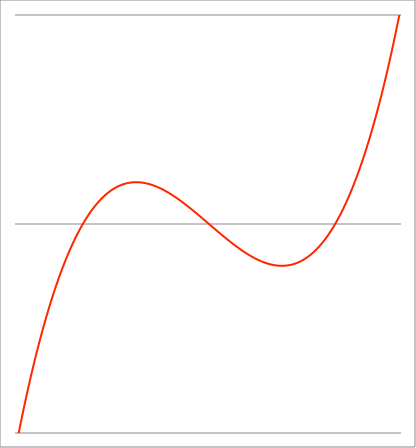
| Category | Series 1 |
|---|---|
| -3.65 | -1.066 |
| -3.64735 | -1.061 |
| -3.6447 | -1.056 |
| -3.64205 | -1.052 |
| -3.6394 | -1.047 |
| -3.63675 | -1.042 |
| -3.6341 | -1.037 |
| -3.63145 | -1.033 |
| -3.628799999999999 | -1.028 |
| -3.626149999999999 | -1.023 |
| -3.623499999999999 | -1.019 |
| -3.620849999999999 | -1.014 |
| -3.618199999999999 | -1.009 |
| -3.615549999999999 | -1.005 |
| -3.612899999999999 | -1 |
| -3.610249999999999 | -0.995 |
| -3.6076 | -0.991 |
| -3.604949999999999 | -0.986 |
| -3.602299999999999 | -0.982 |
| -3.599649999999999 | -0.977 |
| -3.596999999999999 | -0.972 |
| -3.594349999999999 | -0.968 |
| -3.591699999999999 | -0.963 |
| -3.589049999999999 | -0.959 |
| -3.586399999999999 | -0.954 |
| -3.583749999999999 | -0.95 |
| -3.581099999999999 | -0.945 |
| -3.578449999999999 | -0.941 |
| -3.575799999999999 | -0.936 |
| -3.573149999999999 | -0.932 |
| -3.570499999999999 | -0.927 |
| -3.567849999999999 | -0.923 |
| -3.565199999999999 | -0.918 |
| -3.562549999999999 | -0.914 |
| -3.559899999999998 | -0.91 |
| -3.557249999999998 | -0.905 |
| -3.554599999999998 | -0.901 |
| -3.551949999999998 | -0.896 |
| -3.549299999999998 | -0.892 |
| -3.546649999999998 | -0.888 |
| -3.543999999999998 | -0.883 |
| -3.541349999999998 | -0.879 |
| -3.538699999999998 | -0.875 |
| -3.536049999999998 | -0.87 |
| -3.533399999999998 | -0.866 |
| -3.530749999999998 | -0.862 |
| -3.528099999999998 | -0.857 |
| -3.525449999999998 | -0.853 |
| -3.522799999999998 | -0.849 |
| -3.520149999999998 | -0.845 |
| -3.517499999999998 | -0.84 |
| -3.514849999999998 | -0.836 |
| -3.512199999999998 | -0.832 |
| -3.509549999999998 | -0.828 |
| -3.506899999999998 | -0.823 |
| -3.504249999999998 | -0.819 |
| -3.501599999999998 | -0.815 |
| -3.498949999999998 | -0.811 |
| -3.496299999999997 | -0.807 |
| -3.493649999999997 | -0.803 |
| -3.490999999999997 | -0.798 |
| -3.488349999999997 | -0.794 |
| -3.485699999999997 | -0.79 |
| -3.483049999999997 | -0.786 |
| -3.480399999999997 | -0.782 |
| -3.477749999999997 | -0.778 |
| -3.475099999999997 | -0.774 |
| -3.472449999999997 | -0.77 |
| -3.469799999999997 | -0.766 |
| -3.467149999999997 | -0.762 |
| -3.464499999999997 | -0.758 |
| -3.461849999999997 | -0.753 |
| -3.459199999999997 | -0.749 |
| -3.456549999999997 | -0.745 |
| -3.453899999999997 | -0.741 |
| -3.451249999999997 | -0.737 |
| -3.448599999999997 | -0.734 |
| -3.445949999999997 | -0.73 |
| -3.443299999999997 | -0.726 |
| -3.440649999999997 | -0.722 |
| -3.437999999999997 | -0.718 |
| -3.435349999999997 | -0.714 |
| -3.432699999999997 | -0.71 |
| -3.430049999999996 | -0.706 |
| -3.427399999999996 | -0.702 |
| -3.424749999999996 | -0.698 |
| -3.422099999999996 | -0.694 |
| -3.419449999999996 | -0.69 |
| -3.416799999999996 | -0.687 |
| -3.414149999999996 | -0.683 |
| -3.411499999999996 | -0.679 |
| -3.408849999999996 | -0.675 |
| -3.406199999999996 | -0.671 |
| -3.403549999999996 | -0.667 |
| -3.400899999999996 | -0.664 |
| -3.398249999999996 | -0.66 |
| -3.395599999999996 | -0.656 |
| -3.392949999999996 | -0.652 |
| -3.390299999999996 | -0.649 |
| -3.387649999999996 | -0.645 |
| -3.384999999999996 | -0.641 |
| -3.382349999999996 | -0.637 |
| -3.379699999999996 | -0.634 |
| -3.377049999999996 | -0.63 |
| -3.374399999999996 | -0.626 |
| -3.371749999999996 | -0.623 |
| -3.369099999999995 | -0.619 |
| -3.366449999999995 | -0.615 |
| -3.363799999999995 | -0.612 |
| -3.361149999999995 | -0.608 |
| -3.358499999999995 | -0.604 |
| -3.355849999999995 | -0.601 |
| -3.353199999999995 | -0.597 |
| -3.350549999999995 | -0.594 |
| -3.347899999999995 | -0.59 |
| -3.345249999999995 | -0.586 |
| -3.342599999999995 | -0.583 |
| -3.339949999999995 | -0.579 |
| -3.337299999999995 | -0.576 |
| -3.334649999999995 | -0.572 |
| -3.331999999999995 | -0.569 |
| -3.329349999999995 | -0.565 |
| -3.326699999999995 | -0.562 |
| -3.324049999999995 | -0.558 |
| -3.321399999999995 | -0.555 |
| -3.318749999999995 | -0.551 |
| -3.316099999999995 | -0.548 |
| -3.313449999999995 | -0.544 |
| -3.310799999999995 | -0.541 |
| -3.308149999999995 | -0.537 |
| -3.305499999999995 | -0.534 |
| -3.302849999999994 | -0.53 |
| -3.300199999999994 | -0.527 |
| -3.297549999999994 | -0.524 |
| -3.294899999999994 | -0.52 |
| -3.292249999999994 | -0.517 |
| -3.289599999999994 | -0.513 |
| -3.286949999999994 | -0.51 |
| -3.284299999999994 | -0.507 |
| -3.281649999999994 | -0.503 |
| -3.278999999999994 | -0.5 |
| -3.276349999999994 | -0.497 |
| -3.273699999999994 | -0.493 |
| -3.271049999999994 | -0.49 |
| -3.268399999999994 | -0.487 |
| -3.265749999999994 | -0.483 |
| -3.263099999999994 | -0.48 |
| -3.260449999999994 | -0.477 |
| -3.257799999999994 | -0.474 |
| -3.255149999999994 | -0.47 |
| -3.252499999999994 | -0.467 |
| -3.249849999999994 | -0.464 |
| -3.247199999999993 | -0.461 |
| -3.244549999999994 | -0.457 |
| -3.241899999999994 | -0.454 |
| -3.239249999999994 | -0.451 |
| -3.236599999999993 | -0.448 |
| -3.233949999999993 | -0.445 |
| -3.231299999999993 | -0.442 |
| -3.228649999999993 | -0.438 |
| -3.225999999999993 | -0.435 |
| -3.223349999999993 | -0.432 |
| -3.220699999999993 | -0.429 |
| -3.218049999999993 | -0.426 |
| -3.215399999999993 | -0.423 |
| -3.212749999999993 | -0.42 |
| -3.210099999999993 | -0.417 |
| -3.207449999999993 | -0.413 |
| -3.204799999999993 | -0.41 |
| -3.202149999999993 | -0.407 |
| -3.199499999999993 | -0.404 |
| -3.196849999999993 | -0.401 |
| -3.194199999999993 | -0.398 |
| -3.191549999999993 | -0.395 |
| -3.188899999999993 | -0.392 |
| -3.186249999999993 | -0.389 |
| -3.183599999999992 | -0.386 |
| -3.180949999999993 | -0.383 |
| -3.178299999999993 | -0.38 |
| -3.175649999999993 | -0.377 |
| -3.172999999999992 | -0.374 |
| -3.170349999999992 | -0.371 |
| -3.167699999999992 | -0.368 |
| -3.165049999999992 | -0.365 |
| -3.162399999999992 | -0.362 |
| -3.159749999999992 | -0.359 |
| -3.157099999999992 | -0.357 |
| -3.154449999999992 | -0.354 |
| -3.151799999999992 | -0.351 |
| -3.149149999999992 | -0.348 |
| -3.146499999999992 | -0.345 |
| -3.143849999999992 | -0.342 |
| -3.141199999999992 | -0.339 |
| -3.138549999999992 | -0.336 |
| -3.135899999999992 | -0.334 |
| -3.133249999999992 | -0.331 |
| -3.130599999999992 | -0.328 |
| -3.127949999999992 | -0.325 |
| -3.125299999999992 | -0.322 |
| -3.122649999999992 | -0.32 |
| -3.119999999999992 | -0.317 |
| -3.117349999999992 | -0.314 |
| -3.114699999999992 | -0.311 |
| -3.112049999999992 | -0.309 |
| -3.109399999999991 | -0.306 |
| -3.106749999999991 | -0.303 |
| -3.104099999999991 | -0.3 |
| -3.101449999999991 | -0.298 |
| -3.098799999999991 | -0.295 |
| -3.096149999999991 | -0.292 |
| -3.093499999999991 | -0.289 |
| -3.090849999999991 | -0.287 |
| -3.088199999999991 | -0.284 |
| -3.085549999999991 | -0.281 |
| -3.082899999999991 | -0.279 |
| -3.080249999999991 | -0.276 |
| -3.077599999999991 | -0.273 |
| -3.074949999999991 | -0.271 |
| -3.072299999999991 | -0.268 |
| -3.069649999999991 | -0.266 |
| -3.066999999999991 | -0.263 |
| -3.064349999999991 | -0.26 |
| -3.061699999999991 | -0.258 |
| -3.059049999999991 | -0.255 |
| -3.056399999999991 | -0.253 |
| -3.053749999999991 | -0.25 |
| -3.051099999999991 | -0.248 |
| -3.048449999999991 | -0.245 |
| -3.045799999999991 | -0.242 |
| -3.04314999999999 | -0.24 |
| -3.04049999999999 | -0.237 |
| -3.03784999999999 | -0.235 |
| -3.03519999999999 | -0.232 |
| -3.03254999999999 | -0.23 |
| -3.02989999999999 | -0.227 |
| -3.02724999999999 | -0.225 |
| -3.02459999999999 | -0.223 |
| -3.02194999999999 | -0.22 |
| -3.01929999999999 | -0.218 |
| -3.01664999999999 | -0.215 |
| -3.01399999999999 | -0.213 |
| -3.01134999999999 | -0.21 |
| -3.00869999999999 | -0.208 |
| -3.00604999999999 | -0.205 |
| -3.00339999999999 | -0.203 |
| -3.00074999999999 | -0.201 |
| -2.99809999999999 | -0.198 |
| -2.99544999999999 | -0.196 |
| -2.99279999999999 | -0.194 |
| -2.99014999999999 | -0.191 |
| -2.98749999999999 | -0.189 |
| -2.98484999999999 | -0.187 |
| -2.982199999999989 | -0.184 |
| -2.979549999999989 | -0.182 |
| -2.976899999999989 | -0.18 |
| -2.974249999999989 | -0.177 |
| -2.971599999999989 | -0.175 |
| -2.968949999999989 | -0.173 |
| -2.966299999999989 | -0.17 |
| -2.963649999999989 | -0.168 |
| -2.960999999999989 | -0.166 |
| -2.958349999999989 | -0.164 |
| -2.955699999999989 | -0.161 |
| -2.953049999999989 | -0.159 |
| -2.950399999999989 | -0.157 |
| -2.947749999999989 | -0.155 |
| -2.945099999999989 | -0.152 |
| -2.942449999999989 | -0.15 |
| -2.939799999999989 | -0.148 |
| -2.937149999999989 | -0.146 |
| -2.934499999999989 | -0.144 |
| -2.931849999999989 | -0.141 |
| -2.929199999999989 | -0.139 |
| -2.926549999999989 | -0.137 |
| -2.923899999999989 | -0.135 |
| -2.921249999999989 | -0.133 |
| -2.918599999999989 | -0.131 |
| -2.915949999999988 | -0.129 |
| -2.913299999999988 | -0.126 |
| -2.910649999999988 | -0.124 |
| -2.907999999999988 | -0.122 |
| -2.905349999999988 | -0.12 |
| -2.902699999999988 | -0.118 |
| -2.900049999999988 | -0.116 |
| -2.897399999999988 | -0.114 |
| -2.894749999999988 | -0.112 |
| -2.892099999999988 | -0.11 |
| -2.889449999999988 | -0.108 |
| -2.886799999999988 | -0.106 |
| -2.884149999999988 | -0.104 |
| -2.881499999999988 | -0.102 |
| -2.878849999999988 | -0.1 |
| -2.876199999999988 | -0.098 |
| -2.873549999999988 | -0.096 |
| -2.870899999999988 | -0.094 |
| -2.868249999999988 | -0.092 |
| -2.865599999999988 | -0.09 |
| -2.862949999999988 | -0.088 |
| -2.860299999999988 | -0.086 |
| -2.857649999999988 | -0.084 |
| -2.854999999999987 | -0.082 |
| -2.852349999999987 | -0.08 |
| -2.849699999999987 | -0.078 |
| -2.847049999999987 | -0.076 |
| -2.844399999999987 | -0.074 |
| -2.841749999999987 | -0.072 |
| -2.839099999999987 | -0.07 |
| -2.836449999999987 | -0.068 |
| -2.833799999999987 | -0.067 |
| -2.831149999999987 | -0.065 |
| -2.828499999999987 | -0.063 |
| -2.825849999999987 | -0.061 |
| -2.823199999999987 | -0.059 |
| -2.820549999999987 | -0.057 |
| -2.817899999999987 | -0.055 |
| -2.815249999999987 | -0.054 |
| -2.812599999999987 | -0.052 |
| -2.809949999999987 | -0.05 |
| -2.807299999999987 | -0.048 |
| -2.804649999999987 | -0.046 |
| -2.801999999999987 | -0.045 |
| -2.799349999999987 | -0.043 |
| -2.796699999999987 | -0.041 |
| -2.794049999999987 | -0.039 |
| -2.791399999999986 | -0.037 |
| -2.788749999999986 | -0.036 |
| -2.786099999999986 | -0.034 |
| -2.783449999999986 | -0.032 |
| -2.780799999999986 | -0.03 |
| -2.778149999999986 | -0.029 |
| -2.775499999999986 | -0.027 |
| -2.772849999999986 | -0.025 |
| -2.770199999999986 | -0.024 |
| -2.767549999999986 | -0.022 |
| -2.764899999999986 | -0.02 |
| -2.762249999999986 | -0.019 |
| -2.759599999999986 | -0.017 |
| -2.756949999999986 | -0.015 |
| -2.754299999999986 | -0.014 |
| -2.751649999999986 | -0.012 |
| -2.748999999999986 | -0.01 |
| -2.746349999999986 | -0.009 |
| -2.743699999999986 | -0.007 |
| -2.741049999999986 | -0.005 |
| -2.738399999999986 | -0.004 |
| -2.735749999999986 | -0.002 |
| -2.733099999999986 | -0.001 |
| -2.730449999999986 | 0.001 |
| -2.727799999999985 | 0.003 |
| -2.725149999999985 | 0.004 |
| -2.722499999999985 | 0.006 |
| -2.719849999999985 | 0.007 |
| -2.717199999999985 | 0.009 |
| -2.714549999999985 | 0.01 |
| -2.711899999999985 | 0.012 |
| -2.709249999999985 | 0.013 |
| -2.706599999999985 | 0.015 |
| -2.703949999999985 | 0.016 |
| -2.701299999999985 | 0.018 |
| -2.698649999999985 | 0.019 |
| -2.695999999999985 | 0.021 |
| -2.693349999999985 | 0.022 |
| -2.690699999999985 | 0.024 |
| -2.688049999999985 | 0.025 |
| -2.685399999999985 | 0.027 |
| -2.682749999999985 | 0.028 |
| -2.680099999999985 | 0.03 |
| -2.677449999999985 | 0.031 |
| -2.674799999999985 | 0.033 |
| -2.672149999999985 | 0.034 |
| -2.669499999999985 | 0.036 |
| -2.666849999999985 | 0.037 |
| -2.664199999999984 | 0.038 |
| -2.661549999999984 | 0.04 |
| -2.658899999999984 | 0.041 |
| -2.656249999999984 | 0.043 |
| -2.653599999999984 | 0.044 |
| -2.650949999999984 | 0.045 |
| -2.648299999999984 | 0.047 |
| -2.645649999999984 | 0.048 |
| -2.642999999999984 | 0.049 |
| -2.640349999999984 | 0.051 |
| -2.637699999999984 | 0.052 |
| -2.635049999999984 | 0.053 |
| -2.632399999999984 | 0.055 |
| -2.629749999999984 | 0.056 |
| -2.627099999999984 | 0.057 |
| -2.624449999999984 | 0.059 |
| -2.621799999999984 | 0.06 |
| -2.619149999999984 | 0.061 |
| -2.616499999999984 | 0.063 |
| -2.613849999999984 | 0.064 |
| -2.611199999999984 | 0.065 |
| -2.608549999999984 | 0.066 |
| -2.605899999999984 | 0.068 |
| -2.603249999999984 | 0.069 |
| -2.600599999999984 | 0.07 |
| -2.597949999999984 | 0.071 |
| -2.595299999999983 | 0.073 |
| -2.592649999999983 | 0.074 |
| -2.589999999999983 | 0.075 |
| -2.587349999999983 | 0.076 |
| -2.584699999999983 | 0.077 |
| -2.582049999999983 | 0.079 |
| -2.579399999999983 | 0.08 |
| -2.576749999999983 | 0.081 |
| -2.574099999999983 | 0.082 |
| -2.571449999999983 | 0.083 |
| -2.568799999999983 | 0.085 |
| -2.566149999999983 | 0.086 |
| -2.563499999999983 | 0.087 |
| -2.560849999999983 | 0.088 |
| -2.558199999999983 | 0.089 |
| -2.555549999999983 | 0.09 |
| -2.552899999999983 | 0.091 |
| -2.550249999999983 | 0.093 |
| -2.547599999999983 | 0.094 |
| -2.544949999999983 | 0.095 |
| -2.542299999999983 | 0.096 |
| -2.539649999999983 | 0.097 |
| -2.536999999999983 | 0.098 |
| -2.534349999999983 | 0.099 |
| -2.531699999999983 | 0.1 |
| -2.529049999999982 | 0.101 |
| -2.526399999999982 | 0.102 |
| -2.523749999999982 | 0.103 |
| -2.521099999999982 | 0.104 |
| -2.518449999999982 | 0.105 |
| -2.515799999999982 | 0.106 |
| -2.513149999999982 | 0.107 |
| -2.510499999999982 | 0.109 |
| -2.507849999999982 | 0.11 |
| -2.505199999999982 | 0.111 |
| -2.502549999999982 | 0.112 |
| -2.499899999999982 | 0.113 |
| -2.497249999999982 | 0.114 |
| -2.494599999999982 | 0.115 |
| -2.491949999999982 | 0.115 |
| -2.489299999999982 | 0.116 |
| -2.486649999999982 | 0.117 |
| -2.483999999999982 | 0.118 |
| -2.481349999999982 | 0.119 |
| -2.478699999999982 | 0.12 |
| -2.476049999999982 | 0.121 |
| -2.473399999999982 | 0.122 |
| -2.470749999999982 | 0.123 |
| -2.468099999999981 | 0.124 |
| -2.465449999999981 | 0.125 |
| -2.462799999999981 | 0.126 |
| -2.460149999999981 | 0.127 |
| -2.457499999999981 | 0.128 |
| -2.454849999999981 | 0.129 |
| -2.452199999999981 | 0.129 |
| -2.449549999999981 | 0.13 |
| -2.446899999999981 | 0.131 |
| -2.444249999999981 | 0.132 |
| -2.441599999999981 | 0.133 |
| -2.438949999999981 | 0.134 |
| -2.436299999999981 | 0.135 |
| -2.433649999999981 | 0.135 |
| -2.430999999999981 | 0.136 |
| -2.428349999999981 | 0.137 |
| -2.425699999999981 | 0.138 |
| -2.423049999999981 | 0.139 |
| -2.420399999999981 | 0.14 |
| -2.417749999999981 | 0.14 |
| -2.415099999999981 | 0.141 |
| -2.412449999999981 | 0.142 |
| -2.409799999999981 | 0.143 |
| -2.407149999999981 | 0.144 |
| -2.404499999999981 | 0.144 |
| -2.40184999999998 | 0.145 |
| -2.39919999999998 | 0.146 |
| -2.39654999999998 | 0.147 |
| -2.39389999999998 | 0.147 |
| -2.39124999999998 | 0.148 |
| -2.38859999999998 | 0.149 |
| -2.38594999999998 | 0.15 |
| -2.38329999999998 | 0.15 |
| -2.38064999999998 | 0.151 |
| -2.37799999999998 | 0.152 |
| -2.37534999999998 | 0.152 |
| -2.37269999999998 | 0.153 |
| -2.37004999999998 | 0.154 |
| -2.36739999999998 | 0.155 |
| -2.36474999999998 | 0.155 |
| -2.36209999999998 | 0.156 |
| -2.35944999999998 | 0.157 |
| -2.35679999999998 | 0.157 |
| -2.35414999999998 | 0.158 |
| -2.35149999999998 | 0.159 |
| -2.34884999999998 | 0.159 |
| -2.34619999999998 | 0.16 |
| -2.34354999999998 | 0.161 |
| -2.34089999999998 | 0.161 |
| -2.338249999999979 | 0.162 |
| -2.335599999999979 | 0.162 |
| -2.332949999999979 | 0.163 |
| -2.330299999999979 | 0.164 |
| -2.327649999999979 | 0.164 |
| -2.324999999999979 | 0.165 |
| -2.322349999999979 | 0.165 |
| -2.319699999999979 | 0.166 |
| -2.317049999999979 | 0.167 |
| -2.314399999999979 | 0.167 |
| -2.311749999999979 | 0.168 |
| -2.309099999999979 | 0.168 |
| -2.306449999999979 | 0.169 |
| -2.303799999999979 | 0.17 |
| -2.301149999999979 | 0.17 |
| -2.298499999999979 | 0.171 |
| -2.295849999999979 | 0.171 |
| -2.293199999999979 | 0.172 |
| -2.290549999999979 | 0.172 |
| -2.287899999999979 | 0.173 |
| -2.285249999999979 | 0.173 |
| -2.282599999999979 | 0.174 |
| -2.279949999999979 | 0.174 |
| -2.277299999999979 | 0.175 |
| -2.274649999999979 | 0.175 |
| -2.271999999999978 | 0.176 |
| -2.269349999999978 | 0.176 |
| -2.266699999999978 | 0.177 |
| -2.264049999999978 | 0.177 |
| -2.261399999999978 | 0.178 |
| -2.258749999999978 | 0.178 |
| -2.256099999999978 | 0.179 |
| -2.253449999999978 | 0.179 |
| -2.250799999999978 | 0.18 |
| -2.248149999999978 | 0.18 |
| -2.245499999999978 | 0.18 |
| -2.242849999999978 | 0.181 |
| -2.240199999999978 | 0.181 |
| -2.237549999999978 | 0.182 |
| -2.234899999999978 | 0.182 |
| -2.232249999999978 | 0.183 |
| -2.229599999999978 | 0.183 |
| -2.226949999999978 | 0.183 |
| -2.224299999999978 | 0.184 |
| -2.221649999999978 | 0.184 |
| -2.218999999999978 | 0.185 |
| -2.216349999999978 | 0.185 |
| -2.213699999999978 | 0.185 |
| -2.211049999999978 | 0.186 |
| -2.208399999999977 | 0.186 |
| -2.205749999999977 | 0.186 |
| -2.203099999999977 | 0.187 |
| -2.200449999999977 | 0.187 |
| -2.197799999999977 | 0.187 |
| -2.195149999999977 | 0.188 |
| -2.192499999999977 | 0.188 |
| -2.189849999999977 | 0.189 |
| -2.187199999999977 | 0.189 |
| -2.184549999999977 | 0.189 |
| -2.181899999999977 | 0.189 |
| -2.179249999999977 | 0.19 |
| -2.176599999999977 | 0.19 |
| -2.173949999999977 | 0.19 |
| -2.171299999999977 | 0.191 |
| -2.168649999999977 | 0.191 |
| -2.165999999999977 | 0.191 |
| -2.163349999999977 | 0.192 |
| -2.160699999999977 | 0.192 |
| -2.158049999999977 | 0.192 |
| -2.155399999999977 | 0.192 |
| -2.152749999999977 | 0.193 |
| -2.150099999999977 | 0.193 |
| -2.147449999999977 | 0.193 |
| -2.144799999999976 | 0.193 |
| -2.142149999999976 | 0.194 |
| -2.139499999999976 | 0.194 |
| -2.136849999999976 | 0.194 |
| -2.134199999999976 | 0.194 |
| -2.131549999999976 | 0.195 |
| -2.128899999999976 | 0.195 |
| -2.126249999999976 | 0.195 |
| -2.123599999999976 | 0.195 |
| -2.120949999999976 | 0.195 |
| -2.118299999999976 | 0.196 |
| -2.115649999999976 | 0.196 |
| -2.112999999999976 | 0.196 |
| -2.110349999999976 | 0.196 |
| -2.107699999999976 | 0.196 |
| -2.105049999999976 | 0.197 |
| -2.102399999999976 | 0.197 |
| -2.099749999999976 | 0.197 |
| -2.097099999999976 | 0.197 |
| -2.094449999999976 | 0.197 |
| -2.091799999999976 | 0.197 |
| -2.089149999999976 | 0.198 |
| -2.086499999999976 | 0.198 |
| -2.083849999999976 | 0.198 |
| -2.081199999999975 | 0.198 |
| -2.078549999999975 | 0.198 |
| -2.075899999999975 | 0.198 |
| -2.073249999999975 | 0.198 |
| -2.070599999999975 | 0.198 |
| -2.067949999999975 | 0.199 |
| -2.065299999999975 | 0.199 |
| -2.062649999999975 | 0.199 |
| -2.059999999999975 | 0.199 |
| -2.057349999999975 | 0.199 |
| -2.054699999999975 | 0.199 |
| -2.052049999999975 | 0.199 |
| -2.049399999999975 | 0.199 |
| -2.046749999999975 | 0.199 |
| -2.044099999999975 | 0.199 |
| -2.041449999999975 | 0.199 |
| -2.038799999999975 | 0.2 |
| -2.036149999999975 | 0.2 |
| -2.033499999999975 | 0.2 |
| -2.030849999999975 | 0.2 |
| -2.028199999999975 | 0.2 |
| -2.025549999999975 | 0.2 |
| -2.022899999999975 | 0.2 |
| -2.020249999999975 | 0.2 |
| -2.017599999999975 | 0.2 |
| -2.014949999999974 | 0.2 |
| -2.012299999999974 | 0.2 |
| -2.009649999999974 | 0.2 |
| -2.006999999999974 | 0.2 |
| -2.004349999999974 | 0.2 |
| -2.001699999999974 | 0.2 |
| -1.999049999999974 | 0.2 |
| -1.996399999999974 | 0.2 |
| -1.993749999999974 | 0.2 |
| -1.991099999999974 | 0.2 |
| -1.988449999999974 | 0.2 |
| -1.985799999999974 | 0.2 |
| -1.983149999999974 | 0.2 |
| -1.980499999999974 | 0.2 |
| -1.977849999999974 | 0.2 |
| -1.975199999999974 | 0.2 |
| -1.972549999999974 | 0.2 |
| -1.969899999999974 | 0.2 |
| -1.967249999999974 | 0.2 |
| -1.964599999999974 | 0.2 |
| -1.961949999999974 | 0.2 |
| -1.959299999999974 | 0.2 |
| -1.956649999999974 | 0.199 |
| -1.953999999999974 | 0.199 |
| -1.951349999999973 | 0.199 |
| -1.948699999999973 | 0.199 |
| -1.946049999999973 | 0.199 |
| -1.943399999999973 | 0.199 |
| -1.940749999999973 | 0.199 |
| -1.938099999999973 | 0.199 |
| -1.935449999999973 | 0.199 |
| -1.932799999999973 | 0.199 |
| -1.930149999999973 | 0.199 |
| -1.927499999999973 | 0.198 |
| -1.924849999999973 | 0.198 |
| -1.922199999999973 | 0.198 |
| -1.919549999999973 | 0.198 |
| -1.916899999999973 | 0.198 |
| -1.914249999999973 | 0.198 |
| -1.911599999999973 | 0.198 |
| -1.908949999999973 | 0.198 |
| -1.906299999999973 | 0.197 |
| -1.903649999999973 | 0.197 |
| -1.900999999999973 | 0.197 |
| -1.898349999999973 | 0.197 |
| -1.895699999999973 | 0.197 |
| -1.893049999999973 | 0.197 |
| -1.890399999999972 | 0.197 |
| -1.887749999999972 | 0.196 |
| -1.885099999999972 | 0.196 |
| -1.882449999999972 | 0.196 |
| -1.879799999999972 | 0.196 |
| -1.877149999999972 | 0.196 |
| -1.874499999999972 | 0.195 |
| -1.871849999999972 | 0.195 |
| -1.869199999999972 | 0.195 |
| -1.866549999999972 | 0.195 |
| -1.863899999999972 | 0.195 |
| -1.861249999999972 | 0.194 |
| -1.858599999999972 | 0.194 |
| -1.855949999999972 | 0.194 |
| -1.853299999999972 | 0.194 |
| -1.850649999999972 | 0.194 |
| -1.847999999999972 | 0.193 |
| -1.845349999999972 | 0.193 |
| -1.842699999999972 | 0.193 |
| -1.840049999999972 | 0.193 |
| -1.837399999999972 | 0.192 |
| -1.834749999999972 | 0.192 |
| -1.832099999999972 | 0.192 |
| -1.829449999999972 | 0.192 |
| -1.826799999999972 | 0.192 |
| -1.824149999999971 | 0.191 |
| -1.821499999999971 | 0.191 |
| -1.818849999999971 | 0.191 |
| -1.816199999999971 | 0.19 |
| -1.813549999999971 | 0.19 |
| -1.810899999999971 | 0.19 |
| -1.808249999999971 | 0.19 |
| -1.805599999999971 | 0.189 |
| -1.802949999999971 | 0.189 |
| -1.800299999999971 | 0.189 |
| -1.797649999999971 | 0.189 |
| -1.794999999999971 | 0.188 |
| -1.792349999999971 | 0.188 |
| -1.789699999999971 | 0.188 |
| -1.787049999999971 | 0.187 |
| -1.784399999999971 | 0.187 |
| -1.781749999999971 | 0.187 |
| -1.779099999999971 | 0.186 |
| -1.776449999999971 | 0.186 |
| -1.773799999999971 | 0.186 |
| -1.771149999999971 | 0.185 |
| -1.768499999999971 | 0.185 |
| -1.765849999999971 | 0.185 |
| -1.76319999999997 | 0.185 |
| -1.76054999999997 | 0.184 |
| -1.75789999999997 | 0.184 |
| -1.75524999999997 | 0.183 |
| -1.75259999999997 | 0.183 |
| -1.74994999999997 | 0.183 |
| -1.74729999999997 | 0.182 |
| -1.74464999999997 | 0.182 |
| -1.74199999999997 | 0.182 |
| -1.73934999999997 | 0.181 |
| -1.73669999999997 | 0.181 |
| -1.73404999999997 | 0.181 |
| -1.73139999999997 | 0.18 |
| -1.72874999999997 | 0.18 |
| -1.72609999999997 | 0.18 |
| -1.72344999999997 | 0.179 |
| -1.72079999999997 | 0.179 |
| -1.71814999999997 | 0.178 |
| -1.71549999999997 | 0.178 |
| -1.71284999999997 | 0.178 |
| -1.71019999999997 | 0.177 |
| -1.70754999999997 | 0.177 |
| -1.70489999999997 | 0.176 |
| -1.70224999999997 | 0.176 |
| -1.699599999999969 | 0.176 |
| -1.696949999999969 | 0.175 |
| -1.694299999999969 | 0.175 |
| -1.691649999999969 | 0.174 |
| -1.688999999999969 | 0.174 |
| -1.686349999999969 | 0.174 |
| -1.683699999999969 | 0.173 |
| -1.681049999999969 | 0.173 |
| -1.678399999999969 | 0.172 |
| -1.675749999999969 | 0.172 |
| -1.673099999999969 | 0.171 |
| -1.67044999999997 | 0.171 |
| -1.667799999999969 | 0.171 |
| -1.665149999999969 | 0.17 |
| -1.662499999999969 | 0.17 |
| -1.659849999999969 | 0.169 |
| -1.657199999999969 | 0.169 |
| -1.654549999999969 | 0.168 |
| -1.651899999999969 | 0.168 |
| -1.649249999999969 | 0.167 |
| -1.646599999999969 | 0.167 |
| -1.643949999999969 | 0.166 |
| -1.641299999999969 | 0.166 |
| -1.638649999999969 | 0.166 |
| -1.635999999999968 | 0.165 |
| -1.633349999999968 | 0.165 |
| -1.630699999999968 | 0.164 |
| -1.628049999999968 | 0.164 |
| -1.625399999999968 | 0.163 |
| -1.622749999999968 | 0.163 |
| -1.620099999999968 | 0.162 |
| -1.617449999999968 | 0.162 |
| -1.614799999999968 | 0.161 |
| -1.612149999999968 | 0.161 |
| -1.609499999999968 | 0.16 |
| -1.606849999999968 | 0.16 |
| -1.604199999999968 | 0.159 |
| -1.601549999999968 | 0.159 |
| -1.598899999999968 | 0.158 |
| -1.596249999999968 | 0.158 |
| -1.593599999999968 | 0.157 |
| -1.590949999999968 | 0.157 |
| -1.588299999999968 | 0.156 |
| -1.585649999999968 | 0.156 |
| -1.582999999999968 | 0.155 |
| -1.580349999999968 | 0.155 |
| -1.577699999999968 | 0.154 |
| -1.575049999999968 | 0.153 |
| -1.572399999999968 | 0.153 |
| -1.569749999999968 | 0.152 |
| -1.567099999999968 | 0.152 |
| -1.564449999999967 | 0.151 |
| -1.561799999999967 | 0.151 |
| -1.559149999999967 | 0.15 |
| -1.556499999999967 | 0.15 |
| -1.553849999999967 | 0.149 |
| -1.551199999999967 | 0.149 |
| -1.548549999999967 | 0.148 |
| -1.545899999999967 | 0.148 |
| -1.543249999999967 | 0.147 |
| -1.540599999999967 | 0.146 |
| -1.537949999999967 | 0.146 |
| -1.535299999999967 | 0.145 |
| -1.532649999999967 | 0.145 |
| -1.529999999999967 | 0.144 |
| -1.527349999999967 | 0.144 |
| -1.524699999999967 | 0.143 |
| -1.522049999999967 | 0.142 |
| -1.519399999999967 | 0.142 |
| -1.516749999999967 | 0.141 |
| -1.514099999999967 | 0.141 |
| -1.511449999999967 | 0.14 |
| -1.508799999999967 | 0.139 |
| -1.506149999999967 | 0.139 |
| -1.503499999999967 | 0.138 |
| -1.500849999999966 | 0.138 |
| -1.498199999999966 | 0.137 |
| -1.495549999999966 | 0.136 |
| -1.492899999999966 | 0.136 |
| -1.490249999999966 | 0.135 |
| -1.487599999999966 | 0.135 |
| -1.484949999999966 | 0.134 |
| -1.482299999999966 | 0.133 |
| -1.479649999999966 | 0.133 |
| -1.476999999999966 | 0.132 |
| -1.474349999999966 | 0.132 |
| -1.471699999999966 | 0.131 |
| -1.469049999999966 | 0.13 |
| -1.466399999999966 | 0.13 |
| -1.463749999999966 | 0.129 |
| -1.461099999999966 | 0.129 |
| -1.458449999999966 | 0.128 |
| -1.455799999999966 | 0.127 |
| -1.453149999999966 | 0.127 |
| -1.450499999999966 | 0.126 |
| -1.447849999999966 | 0.125 |
| -1.445199999999966 | 0.125 |
| -1.442549999999966 | 0.124 |
| -1.439899999999966 | 0.123 |
| -1.437249999999965 | 0.123 |
| -1.434599999999965 | 0.122 |
| -1.431949999999965 | 0.122 |
| -1.429299999999965 | 0.121 |
| -1.426649999999965 | 0.12 |
| -1.423999999999965 | 0.12 |
| -1.421349999999965 | 0.119 |
| -1.418699999999965 | 0.118 |
| -1.416049999999965 | 0.118 |
| -1.413399999999965 | 0.117 |
| -1.410749999999965 | 0.116 |
| -1.408099999999965 | 0.116 |
| -1.405449999999965 | 0.115 |
| -1.402799999999965 | 0.114 |
| -1.400149999999965 | 0.114 |
| -1.397499999999965 | 0.113 |
| -1.394849999999965 | 0.112 |
| -1.392199999999965 | 0.112 |
| -1.389549999999965 | 0.111 |
| -1.386899999999965 | 0.11 |
| -1.384249999999965 | 0.11 |
| -1.381599999999965 | 0.109 |
| -1.378949999999965 | 0.108 |
| -1.376299999999964 | 0.108 |
| -1.373649999999964 | 0.107 |
| -1.370999999999964 | 0.106 |
| -1.368349999999964 | 0.106 |
| -1.365699999999964 | 0.105 |
| -1.363049999999964 | 0.104 |
| -1.360399999999964 | 0.103 |
| -1.357749999999964 | 0.103 |
| -1.355099999999964 | 0.102 |
| -1.352449999999964 | 0.101 |
| -1.349799999999964 | 0.101 |
| -1.347149999999964 | 0.1 |
| -1.344499999999964 | 0.099 |
| -1.341849999999964 | 0.099 |
| -1.339199999999964 | 0.098 |
| -1.336549999999964 | 0.097 |
| -1.333899999999964 | 0.096 |
| -1.331249999999964 | 0.096 |
| -1.328599999999964 | 0.095 |
| -1.325949999999964 | 0.094 |
| -1.323299999999964 | 0.094 |
| -1.320649999999964 | 0.093 |
| -1.317999999999964 | 0.092 |
| -1.315349999999964 | 0.091 |
| -1.312699999999964 | 0.091 |
| -1.310049999999963 | 0.09 |
| -1.307399999999963 | 0.089 |
| -1.304749999999963 | 0.089 |
| -1.302099999999963 | 0.088 |
| -1.299449999999963 | 0.087 |
| -1.296799999999963 | 0.086 |
| -1.294149999999963 | 0.086 |
| -1.291499999999963 | 0.085 |
| -1.288849999999963 | 0.084 |
| -1.286199999999963 | 0.084 |
| -1.283549999999963 | 0.083 |
| -1.280899999999963 | 0.082 |
| -1.278249999999963 | 0.081 |
| -1.275599999999963 | 0.081 |
| -1.272949999999963 | 0.08 |
| -1.270299999999963 | 0.079 |
| -1.267649999999963 | 0.078 |
| -1.264999999999963 | 0.078 |
| -1.262349999999963 | 0.077 |
| -1.259699999999963 | 0.076 |
| -1.257049999999963 | 0.075 |
| -1.254399999999963 | 0.075 |
| -1.251749999999963 | 0.074 |
| -1.249099999999963 | 0.073 |
| -1.246449999999963 | 0.072 |
| -1.243799999999962 | 0.072 |
| -1.241149999999962 | 0.071 |
| -1.238499999999962 | 0.07 |
| -1.235849999999962 | 0.069 |
| -1.233199999999962 | 0.069 |
| -1.230549999999962 | 0.068 |
| -1.227899999999962 | 0.067 |
| -1.225249999999962 | 0.066 |
| -1.222599999999962 | 0.066 |
| -1.219949999999962 | 0.065 |
| -1.217299999999962 | 0.064 |
| -1.214649999999962 | 0.063 |
| -1.211999999999962 | 0.063 |
| -1.209349999999962 | 0.062 |
| -1.206699999999962 | 0.061 |
| -1.204049999999962 | 0.06 |
| -1.201399999999962 | 0.06 |
| -1.198749999999962 | 0.059 |
| -1.196099999999962 | 0.058 |
| -1.193449999999962 | 0.057 |
| -1.190799999999962 | 0.057 |
| -1.188149999999962 | 0.056 |
| -1.185499999999962 | 0.055 |
| -1.182849999999962 | 0.054 |
| -1.180199999999961 | 0.053 |
| -1.177549999999961 | 0.053 |
| -1.174899999999961 | 0.052 |
| -1.172249999999961 | 0.051 |
| -1.169599999999961 | 0.05 |
| -1.166949999999961 | 0.05 |
| -1.164299999999961 | 0.049 |
| -1.161649999999961 | 0.048 |
| -1.158999999999961 | 0.047 |
| -1.156349999999961 | 0.047 |
| -1.153699999999961 | 0.046 |
| -1.151049999999961 | 0.045 |
| -1.148399999999961 | 0.044 |
| -1.145749999999961 | 0.043 |
| -1.143099999999961 | 0.043 |
| -1.140449999999961 | 0.042 |
| -1.137799999999961 | 0.041 |
| -1.135149999999961 | 0.04 |
| -1.132499999999961 | 0.04 |
| -1.129849999999961 | 0.039 |
| -1.127199999999961 | 0.038 |
| -1.124549999999961 | 0.037 |
| -1.121899999999961 | 0.036 |
| -1.119249999999961 | 0.036 |
| -1.116599999999961 | 0.035 |
| -1.11394999999996 | 0.034 |
| -1.11129999999996 | 0.033 |
| -1.10864999999996 | 0.032 |
| -1.10599999999996 | 0.032 |
| -1.10334999999996 | 0.031 |
| -1.10069999999996 | 0.03 |
| -1.09804999999996 | 0.029 |
| -1.09539999999996 | 0.029 |
| -1.09274999999996 | 0.028 |
| -1.09009999999996 | 0.027 |
| -1.08744999999996 | 0.026 |
| -1.08479999999996 | 0.025 |
| -1.08214999999996 | 0.025 |
| -1.07949999999996 | 0.024 |
| -1.07684999999996 | 0.023 |
| -1.07419999999996 | 0.022 |
| -1.07154999999996 | 0.021 |
| -1.06889999999996 | 0.021 |
| -1.06624999999996 | 0.02 |
| -1.06359999999996 | 0.019 |
| -1.06094999999996 | 0.018 |
| -1.05829999999996 | 0.017 |
| -1.05564999999996 | 0.017 |
| -1.05299999999996 | 0.016 |
| -1.050349999999959 | 0.015 |
| -1.047699999999959 | 0.014 |
| -1.045049999999959 | 0.014 |
| -1.042399999999959 | 0.013 |
| -1.039749999999959 | 0.012 |
| -1.037099999999959 | 0.011 |
| -1.034449999999959 | 0.01 |
| -1.031799999999959 | 0.01 |
| -1.029149999999959 | 0.009 |
| -1.026499999999959 | 0.008 |
| -1.023849999999959 | 0.007 |
| -1.021199999999959 | 0.006 |
| -1.018549999999959 | 0.006 |
| -1.015899999999959 | 0.005 |
| -1.013249999999959 | 0.004 |
| -1.010599999999959 | 0.003 |
| -1.007949999999959 | 0.002 |
| -1.005299999999959 | 0.002 |
| -1.002649999999959 | 0.001 |
| -0.999999999999959 | 0 |
| -0.997349999999959 | -0.001 |
| -0.994699999999959 | -0.002 |
| -0.992049999999959 | -0.002 |
| -0.989399999999958 | -0.003 |
| -0.986749999999958 | -0.004 |
| -0.984099999999958 | -0.005 |
| -0.981449999999958 | -0.006 |
| -0.978799999999958 | -0.006 |
| -0.976149999999958 | -0.007 |
| -0.973499999999958 | -0.008 |
| -0.970849999999958 | -0.009 |
| -0.968199999999958 | -0.01 |
| -0.965549999999958 | -0.01 |
| -0.962899999999958 | -0.011 |
| -0.960249999999958 | -0.012 |
| -0.957599999999958 | -0.013 |
| -0.954949999999958 | -0.014 |
| -0.952299999999958 | -0.014 |
| -0.949649999999958 | -0.015 |
| -0.946999999999958 | -0.016 |
| -0.944349999999958 | -0.017 |
| -0.941699999999958 | -0.017 |
| -0.939049999999958 | -0.018 |
| -0.936399999999958 | -0.019 |
| -0.933749999999958 | -0.02 |
| -0.931099999999958 | -0.021 |
| -0.928449999999958 | -0.021 |
| -0.925799999999958 | -0.022 |
| -0.923149999999957 | -0.023 |
| -0.920499999999957 | -0.024 |
| -0.917849999999957 | -0.025 |
| -0.915199999999957 | -0.025 |
| -0.912549999999957 | -0.026 |
| -0.909899999999957 | -0.027 |
| -0.907249999999957 | -0.028 |
| -0.904599999999957 | -0.029 |
| -0.901949999999957 | -0.029 |
| -0.899299999999957 | -0.03 |
| -0.896649999999957 | -0.031 |
| -0.893999999999957 | -0.032 |
| -0.891349999999957 | -0.032 |
| -0.888699999999957 | -0.033 |
| -0.886049999999957 | -0.034 |
| -0.883399999999957 | -0.035 |
| -0.880749999999957 | -0.036 |
| -0.878099999999957 | -0.036 |
| -0.875449999999957 | -0.037 |
| -0.872799999999957 | -0.038 |
| -0.870149999999957 | -0.039 |
| -0.867499999999957 | -0.04 |
| -0.864849999999957 | -0.04 |
| -0.862199999999957 | -0.041 |
| -0.859549999999956 | -0.042 |
| -0.856899999999956 | -0.043 |
| -0.854249999999956 | -0.043 |
| -0.851599999999956 | -0.044 |
| -0.848949999999956 | -0.045 |
| -0.846299999999956 | -0.046 |
| -0.843649999999956 | -0.047 |
| -0.840999999999956 | -0.047 |
| -0.838349999999956 | -0.048 |
| -0.835699999999956 | -0.049 |
| -0.833049999999956 | -0.05 |
| -0.830399999999956 | -0.05 |
| -0.827749999999956 | -0.051 |
| -0.825099999999956 | -0.052 |
| -0.822449999999956 | -0.053 |
| -0.819799999999956 | -0.053 |
| -0.817149999999956 | -0.054 |
| -0.814499999999956 | -0.055 |
| -0.811849999999956 | -0.056 |
| -0.809199999999956 | -0.057 |
| -0.806549999999956 | -0.057 |
| -0.803899999999956 | -0.058 |
| -0.801249999999956 | -0.059 |
| -0.798599999999955 | -0.06 |
| -0.795949999999955 | -0.06 |
| -0.793299999999955 | -0.061 |
| -0.790649999999955 | -0.062 |
| -0.787999999999955 | -0.063 |
| -0.785349999999955 | -0.063 |
| -0.782699999999955 | -0.064 |
| -0.780049999999955 | -0.065 |
| -0.777399999999955 | -0.066 |
| -0.774749999999955 | -0.066 |
| -0.772099999999955 | -0.067 |
| -0.769449999999955 | -0.068 |
| -0.766799999999955 | -0.069 |
| -0.764149999999955 | -0.069 |
| -0.761499999999955 | -0.07 |
| -0.758849999999955 | -0.071 |
| -0.756199999999955 | -0.072 |
| -0.753549999999955 | -0.072 |
| -0.750899999999955 | -0.073 |
| -0.748249999999955 | -0.074 |
| -0.745599999999955 | -0.075 |
| -0.742949999999955 | -0.075 |
| -0.740299999999955 | -0.076 |
| -0.737649999999955 | -0.077 |
| -0.734999999999955 | -0.078 |
| -0.732349999999954 | -0.078 |
| -0.729699999999954 | -0.079 |
| -0.727049999999954 | -0.08 |
| -0.724399999999954 | -0.081 |
| -0.721749999999954 | -0.081 |
| -0.719099999999954 | -0.082 |
| -0.716449999999954 | -0.083 |
| -0.713799999999954 | -0.084 |
| -0.711149999999954 | -0.084 |
| -0.708499999999954 | -0.085 |
| -0.705849999999954 | -0.086 |
| -0.703199999999954 | -0.086 |
| -0.700549999999954 | -0.087 |
| -0.697899999999954 | -0.088 |
| -0.695249999999954 | -0.089 |
| -0.692599999999954 | -0.089 |
| -0.689949999999954 | -0.09 |
| -0.687299999999954 | -0.091 |
| -0.684649999999954 | -0.091 |
| -0.681999999999954 | -0.092 |
| -0.679349999999954 | -0.093 |
| -0.676699999999954 | -0.094 |
| -0.674049999999954 | -0.094 |
| -0.671399999999953 | -0.095 |
| -0.668749999999953 | -0.096 |
| -0.666099999999953 | -0.096 |
| -0.663449999999953 | -0.097 |
| -0.660799999999953 | -0.098 |
| -0.658149999999953 | -0.099 |
| -0.655499999999953 | -0.099 |
| -0.652849999999953 | -0.1 |
| -0.650199999999953 | -0.101 |
| -0.647549999999953 | -0.101 |
| -0.644899999999953 | -0.102 |
| -0.642249999999953 | -0.103 |
| -0.639599999999953 | -0.103 |
| -0.636949999999953 | -0.104 |
| -0.634299999999953 | -0.105 |
| -0.631649999999953 | -0.106 |
| -0.628999999999953 | -0.106 |
| -0.626349999999953 | -0.107 |
| -0.623699999999953 | -0.108 |
| -0.621049999999953 | -0.108 |
| -0.618399999999953 | -0.109 |
| -0.615749999999953 | -0.11 |
| -0.613099999999953 | -0.11 |
| -0.610449999999953 | -0.111 |
| -0.607799999999953 | -0.112 |
| -0.605149999999952 | -0.112 |
| -0.602499999999952 | -0.113 |
| -0.599849999999952 | -0.114 |
| -0.597199999999952 | -0.114 |
| -0.594549999999952 | -0.115 |
| -0.591899999999952 | -0.116 |
| -0.589249999999952 | -0.116 |
| -0.586599999999952 | -0.117 |
| -0.583949999999952 | -0.118 |
| -0.581299999999952 | -0.118 |
| -0.578649999999952 | -0.119 |
| -0.575999999999952 | -0.12 |
| -0.573349999999952 | -0.12 |
| -0.570699999999952 | -0.121 |
| -0.568049999999952 | -0.122 |
| -0.565399999999952 | -0.122 |
| -0.562749999999952 | -0.123 |
| -0.560099999999952 | -0.123 |
| -0.557449999999952 | -0.124 |
| -0.554799999999952 | -0.125 |
| -0.552149999999952 | -0.125 |
| -0.549499999999952 | -0.126 |
| -0.546849999999952 | -0.127 |
| -0.544199999999952 | -0.127 |
| -0.541549999999952 | -0.128 |
| -0.538899999999952 | -0.129 |
| -0.536249999999951 | -0.129 |
| -0.533599999999951 | -0.13 |
| -0.530949999999951 | -0.13 |
| -0.528299999999951 | -0.131 |
| -0.525649999999951 | -0.132 |
| -0.522999999999951 | -0.132 |
| -0.520349999999951 | -0.133 |
| -0.517699999999951 | -0.133 |
| -0.515049999999951 | -0.134 |
| -0.512399999999951 | -0.135 |
| -0.509749999999951 | -0.135 |
| -0.507099999999951 | -0.136 |
| -0.504449999999951 | -0.136 |
| -0.501799999999951 | -0.137 |
| -0.499149999999951 | -0.138 |
| -0.496499999999951 | -0.138 |
| -0.493849999999951 | -0.139 |
| -0.491199999999951 | -0.139 |
| -0.488549999999951 | -0.14 |
| -0.485899999999951 | -0.141 |
| -0.483249999999951 | -0.141 |
| -0.480599999999951 | -0.142 |
| -0.477949999999951 | -0.142 |
| -0.475299999999951 | -0.143 |
| -0.472649999999951 | -0.144 |
| -0.469999999999951 | -0.144 |
| -0.467349999999951 | -0.145 |
| -0.464699999999951 | -0.145 |
| -0.462049999999951 | -0.146 |
| -0.459399999999951 | -0.146 |
| -0.456749999999951 | -0.147 |
| -0.454099999999951 | -0.148 |
| -0.451449999999951 | -0.148 |
| -0.448799999999951 | -0.149 |
| -0.446149999999951 | -0.149 |
| -0.443499999999951 | -0.15 |
| -0.440849999999951 | -0.15 |
| -0.438199999999951 | -0.151 |
| -0.435549999999951 | -0.151 |
| -0.432899999999951 | -0.152 |
| -0.430249999999951 | -0.152 |
| -0.427599999999951 | -0.153 |
| -0.424949999999951 | -0.153 |
| -0.422299999999951 | -0.154 |
| -0.419649999999951 | -0.155 |
| -0.416999999999951 | -0.155 |
| -0.414349999999951 | -0.156 |
| -0.411699999999951 | -0.156 |
| -0.409049999999951 | -0.157 |
| -0.406399999999951 | -0.157 |
| -0.403749999999951 | -0.158 |
| -0.401099999999951 | -0.158 |
| -0.398449999999951 | -0.159 |
| -0.395799999999951 | -0.159 |
| -0.393149999999951 | -0.16 |
| -0.390499999999951 | -0.16 |
| -0.387849999999952 | -0.161 |
| -0.385199999999952 | -0.161 |
| -0.382549999999952 | -0.162 |
| -0.379899999999952 | -0.162 |
| -0.377249999999952 | -0.163 |
| -0.374599999999952 | -0.163 |
| -0.371949999999952 | -0.164 |
| -0.369299999999952 | -0.164 |
| -0.366649999999952 | -0.165 |
| -0.363999999999952 | -0.165 |
| -0.361349999999952 | -0.166 |
| -0.358699999999952 | -0.166 |
| -0.356049999999952 | -0.166 |
| -0.353399999999952 | -0.167 |
| -0.350749999999952 | -0.167 |
| -0.348099999999952 | -0.168 |
| -0.345449999999952 | -0.168 |
| -0.342799999999952 | -0.169 |
| -0.340149999999952 | -0.169 |
| -0.337499999999952 | -0.17 |
| -0.334849999999952 | -0.17 |
| -0.332199999999952 | -0.171 |
| -0.329549999999952 | -0.171 |
| -0.326899999999952 | -0.171 |
| -0.324249999999952 | -0.172 |
| -0.321599999999952 | -0.172 |
| -0.318949999999952 | -0.173 |
| -0.316299999999952 | -0.173 |
| -0.313649999999952 | -0.174 |
| -0.310999999999952 | -0.174 |
| -0.308349999999952 | -0.174 |
| -0.305699999999952 | -0.175 |
| -0.303049999999952 | -0.175 |
| -0.300399999999952 | -0.176 |
| -0.297749999999952 | -0.176 |
| -0.295099999999952 | -0.176 |
| -0.292449999999952 | -0.177 |
| -0.289799999999952 | -0.177 |
| -0.287149999999952 | -0.178 |
| -0.284499999999952 | -0.178 |
| -0.281849999999952 | -0.178 |
| -0.279199999999952 | -0.179 |
| -0.276549999999952 | -0.179 |
| -0.273899999999952 | -0.18 |
| -0.271249999999952 | -0.18 |
| -0.268599999999952 | -0.18 |
| -0.265949999999952 | -0.181 |
| -0.263299999999952 | -0.181 |
| -0.260649999999952 | -0.181 |
| -0.257999999999952 | -0.182 |
| -0.255349999999952 | -0.182 |
| -0.252699999999952 | -0.182 |
| -0.250049999999952 | -0.183 |
| -0.247399999999952 | -0.183 |
| -0.244749999999952 | -0.183 |
| -0.242099999999952 | -0.184 |
| -0.239449999999952 | -0.184 |
| -0.236799999999952 | -0.185 |
| -0.234149999999952 | -0.185 |
| -0.231499999999952 | -0.185 |
| -0.228849999999952 | -0.185 |
| -0.226199999999952 | -0.186 |
| -0.223549999999952 | -0.186 |
| -0.220899999999952 | -0.186 |
| -0.218249999999952 | -0.187 |
| -0.215599999999952 | -0.187 |
| -0.212949999999952 | -0.187 |
| -0.210299999999952 | -0.188 |
| -0.207649999999952 | -0.188 |
| -0.204999999999952 | -0.188 |
| -0.202349999999952 | -0.189 |
| -0.199699999999952 | -0.189 |
| -0.197049999999952 | -0.189 |
| -0.194399999999952 | -0.189 |
| -0.191749999999952 | -0.19 |
| -0.189099999999952 | -0.19 |
| -0.186449999999952 | -0.19 |
| -0.183799999999952 | -0.19 |
| -0.181149999999952 | -0.191 |
| -0.178499999999952 | -0.191 |
| -0.175849999999952 | -0.191 |
| -0.173199999999952 | -0.192 |
| -0.170549999999952 | -0.192 |
| -0.167899999999952 | -0.192 |
| -0.165249999999952 | -0.192 |
| -0.162599999999952 | -0.192 |
| -0.159949999999952 | -0.193 |
| -0.157299999999952 | -0.193 |
| -0.154649999999952 | -0.193 |
| -0.151999999999952 | -0.193 |
| -0.149349999999952 | -0.194 |
| -0.146699999999952 | -0.194 |
| -0.144049999999952 | -0.194 |
| -0.141399999999952 | -0.194 |
| -0.138749999999952 | -0.194 |
| -0.136099999999952 | -0.195 |
| -0.133449999999952 | -0.195 |
| -0.130799999999952 | -0.195 |
| -0.128149999999952 | -0.195 |
| -0.125499999999952 | -0.195 |
| -0.122849999999952 | -0.196 |
| -0.120199999999952 | -0.196 |
| -0.117549999999952 | -0.196 |
| -0.114899999999952 | -0.196 |
| -0.112249999999952 | -0.196 |
| -0.109599999999952 | -0.197 |
| -0.106949999999952 | -0.197 |
| -0.104299999999952 | -0.197 |
| -0.101649999999952 | -0.197 |
| -0.0989999999999517 | -0.197 |
| -0.0963499999999517 | -0.197 |
| -0.0936999999999517 | -0.197 |
| -0.0910499999999517 | -0.198 |
| -0.0883999999999517 | -0.198 |
| -0.0857499999999517 | -0.198 |
| -0.0830999999999517 | -0.198 |
| -0.0804499999999517 | -0.198 |
| -0.0777999999999517 | -0.198 |
| -0.0751499999999517 | -0.198 |
| -0.0724999999999517 | -0.198 |
| -0.0698499999999517 | -0.199 |
| -0.0671999999999517 | -0.199 |
| -0.0645499999999517 | -0.199 |
| -0.0618999999999517 | -0.199 |
| -0.0592499999999517 | -0.199 |
| -0.0565999999999517 | -0.199 |
| -0.0539499999999517 | -0.199 |
| -0.0512999999999517 | -0.199 |
| -0.0486499999999517 | -0.199 |
| -0.0459999999999517 | -0.199 |
| -0.0433499999999517 | -0.199 |
| -0.0406999999999517 | -0.2 |
| -0.0380499999999517 | -0.2 |
| -0.0353999999999517 | -0.2 |
| -0.0327499999999517 | -0.2 |
| -0.0300999999999517 | -0.2 |
| -0.0274499999999517 | -0.2 |
| -0.0247999999999517 | -0.2 |
| -0.0221499999999517 | -0.2 |
| -0.0194999999999517 | -0.2 |
| -0.0168499999999517 | -0.2 |
| -0.0141999999999517 | -0.2 |
| -0.0115499999999517 | -0.2 |
| -0.00889999999995169 | -0.2 |
| -0.0062499999999517 | -0.2 |
| -0.0035999999999517 | -0.2 |
| -0.000949999999951697 | -0.2 |
| 0.0017000000000483 | -0.2 |
| 0.0043500000000483 | -0.2 |
| 0.0070000000000483 | -0.2 |
| 0.0096500000000483 | -0.2 |
| 0.0123000000000483 | -0.2 |
| 0.0149500000000483 | -0.2 |
| 0.0176000000000483 | -0.2 |
| 0.0202500000000483 | -0.2 |
| 0.0229000000000483 | -0.2 |
| 0.0255500000000483 | -0.2 |
| 0.0282000000000483 | -0.2 |
| 0.0308500000000483 | -0.2 |
| 0.0335000000000483 | -0.2 |
| 0.0361500000000483 | -0.2 |
| 0.0388000000000483 | -0.2 |
| 0.0414500000000483 | -0.199 |
| 0.0441000000000483 | -0.199 |
| 0.0467500000000483 | -0.199 |
| 0.0494000000000483 | -0.199 |
| 0.0520500000000483 | -0.199 |
| 0.0547000000000483 | -0.199 |
| 0.0573500000000483 | -0.199 |
| 0.0600000000000483 | -0.199 |
| 0.0626500000000483 | -0.199 |
| 0.0653000000000483 | -0.199 |
| 0.0679500000000483 | -0.199 |
| 0.0706000000000483 | -0.198 |
| 0.0732500000000483 | -0.198 |
| 0.0759000000000483 | -0.198 |
| 0.0785500000000483 | -0.198 |
| 0.0812000000000483 | -0.198 |
| 0.0838500000000483 | -0.198 |
| 0.0865000000000483 | -0.198 |
| 0.0891500000000483 | -0.198 |
| 0.0918000000000483 | -0.197 |
| 0.0944500000000483 | -0.197 |
| 0.0971000000000483 | -0.197 |
| 0.0997500000000483 | -0.197 |
| 0.102400000000048 | -0.197 |
| 0.105050000000048 | -0.197 |
| 0.107700000000048 | -0.196 |
| 0.110350000000048 | -0.196 |
| 0.113000000000048 | -0.196 |
| 0.115650000000048 | -0.196 |
| 0.118300000000048 | -0.196 |
| 0.120950000000048 | -0.195 |
| 0.123600000000048 | -0.195 |
| 0.126250000000048 | -0.195 |
| 0.128900000000048 | -0.195 |
| 0.131550000000048 | -0.195 |
| 0.134200000000048 | -0.194 |
| 0.136850000000048 | -0.194 |
| 0.139500000000048 | -0.194 |
| 0.142150000000048 | -0.194 |
| 0.144800000000048 | -0.193 |
| 0.147450000000048 | -0.193 |
| 0.150100000000048 | -0.193 |
| 0.152750000000048 | -0.193 |
| 0.155400000000048 | -0.192 |
| 0.158050000000048 | -0.192 |
| 0.160700000000048 | -0.192 |
| 0.163350000000048 | -0.192 |
| 0.166000000000048 | -0.191 |
| 0.168650000000048 | -0.191 |
| 0.171300000000049 | -0.191 |
| 0.173950000000049 | -0.19 |
| 0.176600000000049 | -0.19 |
| 0.179250000000049 | -0.19 |
| 0.181900000000049 | -0.189 |
| 0.184550000000049 | -0.189 |
| 0.187200000000049 | -0.189 |
| 0.189850000000049 | -0.189 |
| 0.192500000000049 | -0.188 |
| 0.195150000000049 | -0.188 |
| 0.197800000000049 | -0.187 |
| 0.200450000000049 | -0.187 |
| 0.203100000000049 | -0.187 |
| 0.205750000000049 | -0.186 |
| 0.208400000000049 | -0.186 |
| 0.211050000000049 | -0.186 |
| 0.213700000000049 | -0.185 |
| 0.216350000000049 | -0.185 |
| 0.219000000000049 | -0.185 |
| 0.221650000000049 | -0.184 |
| 0.224300000000049 | -0.184 |
| 0.226950000000049 | -0.183 |
| 0.229600000000049 | -0.183 |
| 0.232250000000049 | -0.183 |
| 0.234900000000049 | -0.182 |
| 0.237550000000049 | -0.182 |
| 0.240200000000049 | -0.181 |
| 0.242850000000049 | -0.181 |
| 0.245500000000049 | -0.18 |
| 0.248150000000049 | -0.18 |
| 0.250800000000049 | -0.18 |
| 0.253450000000049 | -0.179 |
| 0.256100000000049 | -0.179 |
| 0.258750000000049 | -0.178 |
| 0.261400000000049 | -0.178 |
| 0.264050000000049 | -0.177 |
| 0.266700000000049 | -0.177 |
| 0.269350000000049 | -0.176 |
| 0.272000000000049 | -0.176 |
| 0.274650000000049 | -0.175 |
| 0.277300000000049 | -0.175 |
| 0.279950000000049 | -0.174 |
| 0.282600000000049 | -0.174 |
| 0.285250000000049 | -0.173 |
| 0.287900000000049 | -0.173 |
| 0.290550000000049 | -0.172 |
| 0.293200000000049 | -0.172 |
| 0.295850000000049 | -0.171 |
| 0.298500000000049 | -0.171 |
| 0.301150000000049 | -0.17 |
| 0.303800000000049 | -0.17 |
| 0.306450000000049 | -0.169 |
| 0.309100000000049 | -0.168 |
| 0.311750000000049 | -0.168 |
| 0.314400000000049 | -0.167 |
| 0.317050000000049 | -0.167 |
| 0.319700000000049 | -0.166 |
| 0.322350000000048 | -0.165 |
| 0.325000000000048 | -0.165 |
| 0.327650000000048 | -0.164 |
| 0.330300000000048 | -0.164 |
| 0.332950000000048 | -0.163 |
| 0.335600000000048 | -0.162 |
| 0.338250000000048 | -0.162 |
| 0.340900000000048 | -0.161 |
| 0.343550000000048 | -0.161 |
| 0.346200000000048 | -0.16 |
| 0.348850000000048 | -0.159 |
| 0.351500000000048 | -0.159 |
| 0.354150000000048 | -0.158 |
| 0.356800000000048 | -0.157 |
| 0.359450000000048 | -0.157 |
| 0.362100000000048 | -0.156 |
| 0.364750000000048 | -0.155 |
| 0.367400000000048 | -0.155 |
| 0.370050000000048 | -0.154 |
| 0.372700000000048 | -0.153 |
| 0.375350000000048 | -0.152 |
| 0.378000000000048 | -0.152 |
| 0.380650000000048 | -0.151 |
| 0.383300000000048 | -0.15 |
| 0.385950000000048 | -0.15 |
| 0.388600000000048 | -0.149 |
| 0.391250000000048 | -0.148 |
| 0.393900000000048 | -0.147 |
| 0.396550000000048 | -0.147 |
| 0.399200000000048 | -0.146 |
| 0.401850000000048 | -0.145 |
| 0.404500000000048 | -0.144 |
| 0.407150000000048 | -0.144 |
| 0.409800000000048 | -0.143 |
| 0.412450000000048 | -0.142 |
| 0.415100000000048 | -0.141 |
| 0.417750000000048 | -0.14 |
| 0.420400000000048 | -0.14 |
| 0.423050000000048 | -0.139 |
| 0.425700000000048 | -0.138 |
| 0.428350000000048 | -0.137 |
| 0.431000000000048 | -0.136 |
| 0.433650000000048 | -0.135 |
| 0.436300000000048 | -0.135 |
| 0.438950000000048 | -0.134 |
| 0.441600000000048 | -0.133 |
| 0.444250000000048 | -0.132 |
| 0.446900000000048 | -0.131 |
| 0.449550000000048 | -0.13 |
| 0.452200000000048 | -0.129 |
| 0.454850000000048 | -0.129 |
| 0.457500000000048 | -0.128 |
| 0.460150000000048 | -0.127 |
| 0.462800000000048 | -0.126 |
| 0.465450000000048 | -0.125 |
| 0.468100000000048 | -0.124 |
| 0.470750000000048 | -0.123 |
| 0.473400000000048 | -0.122 |
| 0.476050000000048 | -0.121 |
| 0.478700000000048 | -0.12 |
| 0.481350000000048 | -0.119 |
| 0.484000000000048 | -0.118 |
| 0.486650000000048 | -0.117 |
| 0.489300000000048 | -0.116 |
| 0.491950000000048 | -0.115 |
| 0.494600000000048 | -0.115 |
| 0.497250000000048 | -0.114 |
| 0.499900000000048 | -0.113 |
| 0.502550000000048 | -0.112 |
| 0.505200000000048 | -0.111 |
| 0.507850000000048 | -0.11 |
| 0.510500000000048 | -0.109 |
| 0.513150000000048 | -0.107 |
| 0.515800000000048 | -0.106 |
| 0.518450000000048 | -0.105 |
| 0.521100000000048 | -0.104 |
| 0.523750000000048 | -0.103 |
| 0.526400000000048 | -0.102 |
| 0.529050000000048 | -0.101 |
| 0.531700000000048 | -0.1 |
| 0.534350000000048 | -0.099 |
| 0.537000000000048 | -0.098 |
| 0.539650000000048 | -0.097 |
| 0.542300000000048 | -0.096 |
| 0.544950000000048 | -0.095 |
| 0.547600000000048 | -0.094 |
| 0.550250000000048 | -0.093 |
| 0.552900000000048 | -0.091 |
| 0.555550000000048 | -0.09 |
| 0.558200000000048 | -0.089 |
| 0.560850000000048 | -0.088 |
| 0.563500000000049 | -0.087 |
| 0.566150000000049 | -0.086 |
| 0.568800000000049 | -0.085 |
| 0.571450000000049 | -0.083 |
| 0.574100000000049 | -0.082 |
| 0.576750000000049 | -0.081 |
| 0.579400000000049 | -0.08 |
| 0.582050000000049 | -0.079 |
| 0.584700000000049 | -0.077 |
| 0.587350000000049 | -0.076 |
| 0.590000000000049 | -0.075 |
| 0.592650000000049 | -0.074 |
| 0.595300000000049 | -0.073 |
| 0.597950000000049 | -0.071 |
| 0.600600000000049 | -0.07 |
| 0.603250000000049 | -0.069 |
| 0.605900000000049 | -0.068 |
| 0.608550000000049 | -0.066 |
| 0.611200000000049 | -0.065 |
| 0.613850000000049 | -0.064 |
| 0.616500000000049 | -0.063 |
| 0.619150000000049 | -0.061 |
| 0.621800000000049 | -0.06 |
| 0.624450000000049 | -0.059 |
| 0.627100000000049 | -0.057 |
| 0.629750000000049 | -0.056 |
| 0.632400000000049 | -0.055 |
| 0.63505000000005 | -0.053 |
| 0.63770000000005 | -0.052 |
| 0.64035000000005 | -0.051 |
| 0.64300000000005 | -0.049 |
| 0.64565000000005 | -0.048 |
| 0.64830000000005 | -0.047 |
| 0.65095000000005 | -0.045 |
| 0.65360000000005 | -0.044 |
| 0.65625000000005 | -0.043 |
| 0.65890000000005 | -0.041 |
| 0.66155000000005 | -0.04 |
| 0.66420000000005 | -0.038 |
| 0.66685000000005 | -0.037 |
| 0.66950000000005 | -0.036 |
| 0.67215000000005 | -0.034 |
| 0.67480000000005 | -0.033 |
| 0.67745000000005 | -0.031 |
| 0.68010000000005 | -0.03 |
| 0.68275000000005 | -0.028 |
| 0.68540000000005 | -0.027 |
| 0.68805000000005 | -0.025 |
| 0.69070000000005 | -0.024 |
| 0.69335000000005 | -0.022 |
| 0.69600000000005 | -0.021 |
| 0.698650000000051 | -0.019 |
| 0.701300000000051 | -0.018 |
| 0.703950000000051 | -0.016 |
| 0.706600000000051 | -0.015 |
| 0.709250000000051 | -0.013 |
| 0.711900000000051 | -0.012 |
| 0.714550000000051 | -0.01 |
| 0.717200000000051 | -0.009 |
| 0.719850000000051 | -0.007 |
| 0.722500000000051 | -0.006 |
| 0.725150000000051 | -0.004 |
| 0.727800000000051 | -0.003 |
| 0.730450000000051 | -0.001 |
| 0.733100000000051 | 0.001 |
| 0.735750000000051 | 0.002 |
| 0.738400000000051 | 0.004 |
| 0.741050000000051 | 0.005 |
| 0.743700000000051 | 0.007 |
| 0.746350000000051 | 0.009 |
| 0.749000000000051 | 0.01 |
| 0.751650000000051 | 0.012 |
| 0.754300000000051 | 0.014 |
| 0.756950000000051 | 0.015 |
| 0.759600000000051 | 0.017 |
| 0.762250000000052 | 0.019 |
| 0.764900000000052 | 0.02 |
| 0.767550000000052 | 0.022 |
| 0.770200000000052 | 0.024 |
| 0.772850000000052 | 0.025 |
| 0.775500000000052 | 0.027 |
| 0.778150000000052 | 0.029 |
| 0.780800000000052 | 0.03 |
| 0.783450000000052 | 0.032 |
| 0.786100000000052 | 0.034 |
| 0.788750000000052 | 0.036 |
| 0.791400000000052 | 0.037 |
| 0.794050000000052 | 0.039 |
| 0.796700000000052 | 0.041 |
| 0.799350000000052 | 0.043 |
| 0.802000000000052 | 0.045 |
| 0.804650000000052 | 0.046 |
| 0.807300000000052 | 0.048 |
| 0.809950000000052 | 0.05 |
| 0.812600000000052 | 0.052 |
| 0.815250000000052 | 0.054 |
| 0.817900000000052 | 0.055 |
| 0.820550000000052 | 0.057 |
| 0.823200000000053 | 0.059 |
| 0.825850000000053 | 0.061 |
| 0.828500000000053 | 0.063 |
| 0.831150000000053 | 0.065 |
| 0.833800000000053 | 0.067 |
| 0.836450000000053 | 0.068 |
| 0.839100000000053 | 0.07 |
| 0.841750000000053 | 0.072 |
| 0.844400000000053 | 0.074 |
| 0.847050000000053 | 0.076 |
| 0.849700000000053 | 0.078 |
| 0.852350000000053 | 0.08 |
| 0.855000000000053 | 0.082 |
| 0.857650000000053 | 0.084 |
| 0.860300000000053 | 0.086 |
| 0.862950000000053 | 0.088 |
| 0.865600000000053 | 0.09 |
| 0.868250000000053 | 0.092 |
| 0.870900000000053 | 0.094 |
| 0.873550000000053 | 0.096 |
| 0.876200000000053 | 0.098 |
| 0.878850000000053 | 0.1 |
| 0.881500000000053 | 0.102 |
| 0.884150000000053 | 0.104 |
| 0.886800000000053 | 0.106 |
| 0.889450000000054 | 0.108 |
| 0.892100000000054 | 0.11 |
| 0.894750000000054 | 0.112 |
| 0.897400000000054 | 0.114 |
| 0.900050000000054 | 0.116 |
| 0.902700000000054 | 0.118 |
| 0.905350000000054 | 0.12 |
| 0.908000000000054 | 0.122 |
| 0.910650000000054 | 0.124 |
| 0.913300000000054 | 0.126 |
| 0.915950000000054 | 0.129 |
| 0.918600000000054 | 0.131 |
| 0.921250000000054 | 0.133 |
| 0.923900000000054 | 0.135 |
| 0.926550000000054 | 0.137 |
| 0.929200000000054 | 0.139 |
| 0.931850000000054 | 0.141 |
| 0.934500000000054 | 0.144 |
| 0.937150000000054 | 0.146 |
| 0.939800000000054 | 0.148 |
| 0.942450000000054 | 0.15 |
| 0.945100000000054 | 0.152 |
| 0.947750000000054 | 0.155 |
| 0.950400000000055 | 0.157 |
| 0.953050000000055 | 0.159 |
| 0.955700000000055 | 0.161 |
| 0.958350000000055 | 0.164 |
| 0.961000000000055 | 0.166 |
| 0.963650000000055 | 0.168 |
| 0.966300000000055 | 0.17 |
| 0.968950000000055 | 0.173 |
| 0.971600000000055 | 0.175 |
| 0.974250000000055 | 0.177 |
| 0.976900000000055 | 0.18 |
| 0.979550000000055 | 0.182 |
| 0.982200000000055 | 0.184 |
| 0.984850000000055 | 0.187 |
| 0.987500000000055 | 0.189 |
| 0.990150000000055 | 0.191 |
| 0.992800000000055 | 0.194 |
| 0.995450000000055 | 0.196 |
| 0.998100000000055 | 0.198 |
| 1.000750000000055 | 0.201 |
| 1.003400000000055 | 0.203 |
| 1.006050000000055 | 0.205 |
| 1.008700000000055 | 0.208 |
| 1.011350000000055 | 0.21 |
| 1.014000000000056 | 0.213 |
| 1.016650000000056 | 0.215 |
| 1.019300000000056 | 0.218 |
| 1.021950000000056 | 0.22 |
| 1.024600000000056 | 0.223 |
| 1.027250000000056 | 0.225 |
| 1.029900000000056 | 0.227 |
| 1.032550000000056 | 0.23 |
| 1.035200000000056 | 0.232 |
| 1.037850000000056 | 0.235 |
| 1.040500000000056 | 0.237 |
| 1.043150000000056 | 0.24 |
| 1.045800000000056 | 0.242 |
| 1.048450000000056 | 0.245 |
| 1.051100000000056 | 0.248 |
| 1.053750000000056 | 0.25 |
| 1.056400000000056 | 0.253 |
| 1.059050000000056 | 0.255 |
| 1.061700000000056 | 0.258 |
| 1.064350000000056 | 0.26 |
| 1.067000000000056 | 0.263 |
| 1.069650000000056 | 0.266 |
| 1.072300000000056 | 0.268 |
| 1.074950000000056 | 0.271 |
| 1.077600000000057 | 0.273 |
| 1.080250000000057 | 0.276 |
| 1.082900000000057 | 0.279 |
| 1.085550000000057 | 0.281 |
| 1.088200000000057 | 0.284 |
| 1.090850000000057 | 0.287 |
| 1.093500000000057 | 0.289 |
| 1.096150000000057 | 0.292 |
| 1.098800000000057 | 0.295 |
| 1.101450000000057 | 0.298 |
| 1.104100000000057 | 0.3 |
| 1.106750000000057 | 0.303 |
| 1.109400000000057 | 0.306 |
| 1.112050000000057 | 0.309 |
| 1.114700000000057 | 0.311 |
| 1.117350000000057 | 0.314 |
| 1.120000000000057 | 0.317 |
| 1.122650000000057 | 0.32 |
| 1.125300000000057 | 0.322 |
| 1.127950000000057 | 0.325 |
| 1.130600000000057 | 0.328 |
| 1.133250000000057 | 0.331 |
| 1.135900000000057 | 0.334 |
| 1.138550000000057 | 0.336 |
| 1.141200000000057 | 0.339 |
| 1.143850000000058 | 0.342 |
| 1.146500000000058 | 0.345 |
| 1.149150000000058 | 0.348 |
| 1.151800000000058 | 0.351 |
| 1.154450000000058 | 0.354 |
| 1.157100000000058 | 0.357 |
| 1.159750000000058 | 0.359 |
| 1.162400000000058 | 0.362 |
| 1.165050000000058 | 0.365 |
| 1.167700000000058 | 0.368 |
| 1.170350000000058 | 0.371 |
| 1.173000000000058 | 0.374 |
| 1.175650000000058 | 0.377 |
| 1.178300000000058 | 0.38 |
| 1.180950000000058 | 0.383 |
| 1.183600000000058 | 0.386 |
| 1.186250000000058 | 0.389 |
| 1.188900000000058 | 0.392 |
| 1.191550000000058 | 0.395 |
| 1.194200000000058 | 0.398 |
| 1.196850000000058 | 0.401 |
| 1.199500000000058 | 0.404 |
| 1.202150000000058 | 0.407 |
| 1.204800000000058 | 0.41 |
| 1.207450000000059 | 0.413 |
| 1.210100000000059 | 0.417 |
| 1.212750000000059 | 0.42 |
| 1.215400000000059 | 0.423 |
| 1.218050000000059 | 0.426 |
| 1.220700000000059 | 0.429 |
| 1.223350000000059 | 0.432 |
| 1.226000000000059 | 0.435 |
| 1.228650000000059 | 0.438 |
| 1.231300000000059 | 0.442 |
| 1.233950000000059 | 0.445 |
| 1.236600000000059 | 0.448 |
| 1.23925000000006 | 0.451 |
| 1.241900000000059 | 0.454 |
| 1.24455000000006 | 0.457 |
| 1.247200000000059 | 0.461 |
| 1.249850000000059 | 0.464 |
| 1.252500000000059 | 0.467 |
| 1.255150000000059 | 0.47 |
| 1.257800000000059 | 0.474 |
| 1.260450000000059 | 0.477 |
| 1.263100000000059 | 0.48 |
| 1.265750000000059 | 0.483 |
| 1.268400000000059 | 0.487 |
| 1.27105000000006 | 0.49 |
| 1.27370000000006 | 0.493 |
| 1.27635000000006 | 0.497 |
| 1.27900000000006 | 0.5 |
| 1.28165000000006 | 0.503 |
| 1.28430000000006 | 0.507 |
| 1.28695000000006 | 0.51 |
| 1.28960000000006 | 0.513 |
| 1.29225000000006 | 0.517 |
| 1.29490000000006 | 0.52 |
| 1.29755000000006 | 0.524 |
| 1.30020000000006 | 0.527 |
| 1.30285000000006 | 0.53 |
| 1.30550000000006 | 0.534 |
| 1.30815000000006 | 0.537 |
| 1.31080000000006 | 0.541 |
| 1.31345000000006 | 0.544 |
| 1.31610000000006 | 0.548 |
| 1.31875000000006 | 0.551 |
| 1.32140000000006 | 0.555 |
| 1.32405000000006 | 0.558 |
| 1.32670000000006 | 0.562 |
| 1.32935000000006 | 0.565 |
| 1.33200000000006 | 0.569 |
| 1.33465000000006 | 0.572 |
| 1.33730000000006 | 0.576 |
| 1.339950000000061 | 0.579 |
| 1.342600000000061 | 0.583 |
| 1.345250000000061 | 0.586 |
| 1.347900000000061 | 0.59 |
| 1.350550000000061 | 0.594 |
| 1.353200000000061 | 0.597 |
| 1.355850000000061 | 0.601 |
| 1.358500000000061 | 0.604 |
| 1.361150000000061 | 0.608 |
| 1.363800000000061 | 0.612 |
| 1.366450000000061 | 0.615 |
| 1.369100000000061 | 0.619 |
| 1.371750000000061 | 0.623 |
| 1.374400000000061 | 0.626 |
| 1.377050000000061 | 0.63 |
| 1.379700000000061 | 0.634 |
| 1.382350000000061 | 0.637 |
| 1.385000000000061 | 0.641 |
| 1.387650000000061 | 0.645 |
| 1.390300000000061 | 0.649 |
| 1.392950000000061 | 0.652 |
| 1.395600000000061 | 0.656 |
| 1.398250000000061 | 0.66 |
| 1.400900000000062 | 0.664 |
| 1.403550000000062 | 0.667 |
| 1.406200000000062 | 0.671 |
| 1.408850000000062 | 0.675 |
| 1.411500000000062 | 0.679 |
| 1.414150000000062 | 0.683 |
| 1.416800000000062 | 0.687 |
| 1.419450000000062 | 0.69 |
| 1.422100000000062 | 0.694 |
| 1.424750000000062 | 0.698 |
| 1.427400000000062 | 0.702 |
| 1.430050000000062 | 0.706 |
| 1.432700000000062 | 0.71 |
| 1.435350000000062 | 0.714 |
| 1.438000000000062 | 0.718 |
| 1.440650000000062 | 0.722 |
| 1.443300000000062 | 0.726 |
| 1.445950000000062 | 0.73 |
| 1.448600000000062 | 0.734 |
| 1.451250000000062 | 0.737 |
| 1.453900000000062 | 0.741 |
| 1.456550000000062 | 0.745 |
| 1.459200000000062 | 0.749 |
| 1.461850000000062 | 0.753 |
| 1.464500000000062 | 0.758 |
| 1.467150000000063 | 0.762 |
| 1.469800000000063 | 0.766 |
| 1.472450000000063 | 0.77 |
| 1.475100000000063 | 0.774 |
| 1.477750000000063 | 0.778 |
| 1.480400000000063 | 0.782 |
| 1.483050000000063 | 0.786 |
| 1.485700000000063 | 0.79 |
| 1.488350000000063 | 0.794 |
| 1.491000000000063 | 0.798 |
| 1.493650000000063 | 0.803 |
| 1.496300000000063 | 0.807 |
| 1.498950000000063 | 0.811 |
| 1.501600000000063 | 0.815 |
| 1.504250000000063 | 0.819 |
| 1.506900000000063 | 0.823 |
| 1.509550000000063 | 0.828 |
| 1.512200000000063 | 0.832 |
| 1.514850000000063 | 0.836 |
| 1.517500000000063 | 0.84 |
| 1.520150000000063 | 0.845 |
| 1.522800000000063 | 0.849 |
| 1.525450000000063 | 0.853 |
| 1.528100000000064 | 0.857 |
| 1.530750000000064 | 0.862 |
| 1.533400000000064 | 0.866 |
| 1.536050000000064 | 0.87 |
| 1.538700000000064 | 0.875 |
| 1.541350000000064 | 0.879 |
| 1.544000000000064 | 0.883 |
| 1.546650000000064 | 0.888 |
| 1.549300000000064 | 0.892 |
| 1.551950000000064 | 0.896 |
| 1.554600000000064 | 0.901 |
| 1.557250000000064 | 0.905 |
| 1.559900000000064 | 0.91 |
| 1.562550000000064 | 0.914 |
| 1.565200000000064 | 0.918 |
| 1.567850000000064 | 0.923 |
| 1.570500000000064 | 0.927 |
| 1.573150000000064 | 0.932 |
| 1.575800000000064 | 0.936 |
| 1.578450000000064 | 0.941 |
| 1.581100000000064 | 0.945 |
| 1.583750000000064 | 0.95 |
| 1.586400000000064 | 0.954 |
| 1.589050000000064 | 0.959 |
| 1.591700000000064 | 0.963 |
| 1.594350000000065 | 0.968 |
| 1.597000000000065 | 0.972 |
| 1.599650000000065 | 0.977 |
| 1.602300000000065 | 0.982 |
| 1.604950000000065 | 0.986 |
| 1.607600000000065 | 0.991 |
| 1.610250000000065 | 0.995 |
| 1.612900000000065 | 1 |
| 1.615550000000065 | 1.005 |
| 1.618200000000065 | 1.009 |
| 1.620850000000065 | 1.014 |
| 1.623500000000065 | 1.019 |
| 1.626150000000065 | 1.023 |
| 1.628800000000065 | 1.028 |
| 1.631450000000065 | 1.033 |
| 1.634100000000065 | 1.037 |
| 1.636750000000065 | 1.042 |
| 1.639400000000065 | 1.047 |
| 1.642050000000065 | 1.052 |
| 1.644700000000065 | 1.056 |
| 1.647350000000065 | 1.061 |
| 1.650000000000065 | 1.066 |